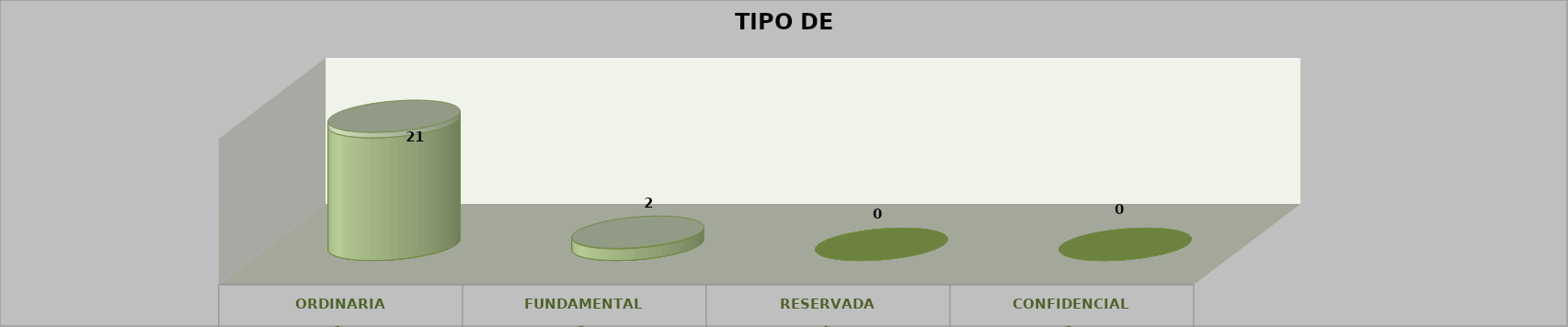
| Category | Series 0 | Series 2 | Series 1 | Series 3 | Series 4 |
|---|---|---|---|---|---|
| 0 |  |  |  | 21 | 0.913 |
| 1 |  |  |  | 2 | 0.087 |
| 2 |  |  |  | 0 | 0 |
| 3 |  |  |  | 0 | 0 |